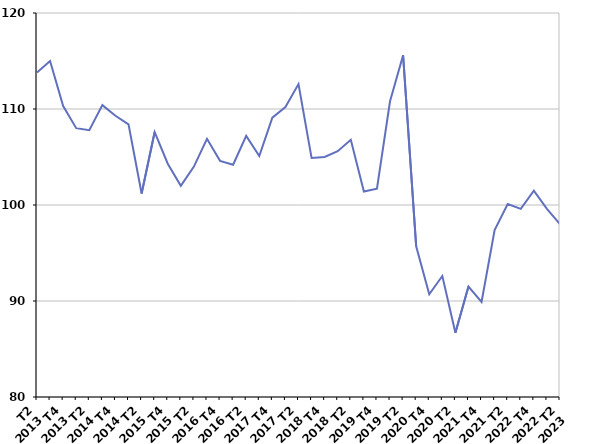
| Category | Fin de contrat |
|---|---|
| T2
2013 | 113.8 |
| T3
2013 | 115 |
| T4
2013 | 110.3 |
| T1
2014 | 108 |
| T2
2014 | 107.8 |
| T3
2014 | 110.4 |
| T4
2014 | 109.3 |
| T1
2015 | 108.4 |
| T2
2015 | 101.2 |
| T3
2015 | 107.6 |
| T4
2015 | 104.3 |
| T1
2016 | 102 |
| T2
2016 | 104 |
| T3
2016 | 106.9 |
| T4
2016 | 104.6 |
| T1
2017 | 104.2 |
| T2
2017 | 107.2 |
| T3
2017 | 105.1 |
| T4
2017 | 109.1 |
| T1
2018 | 110.2 |
| T2
2018 | 112.6 |
| T3
2018 | 104.9 |
| T4
2018 | 105 |
| T1
2019 | 105.6 |
| T2
2019 | 106.8 |
| T3
2019 | 101.4 |
| T4
2019 | 101.7 |
| T1
2020 | 110.8 |
| T2
2020 | 115.6 |
| T3
2020 | 95.7 |
| T4
2020 | 90.7 |
| T1
2021 | 92.6 |
| T2
2021 | 86.7 |
| T3
2021 | 91.5 |
| T4
2021 | 89.9 |
| T1
2022 | 97.4 |
| T2
2022 | 100.1 |
| T3
2022 | 99.6 |
| T4
2022 | 101.5 |
| T1
2023 | 99.6 |
| T2
2023 | 98 |